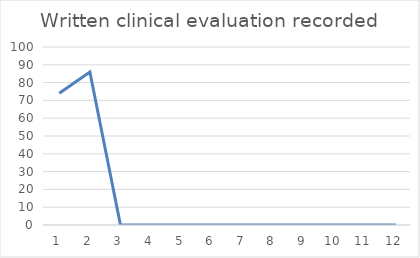
| Category | Written clinical evaluation recorded |
|---|---|
| 0 | 74 |
| 1 | 86 |
| 2 | 0 |
| 3 | 0 |
| 4 | 0 |
| 5 | 0 |
| 6 | 0 |
| 7 | 0 |
| 8 | 0 |
| 9 | 0 |
| 10 | 0 |
| 11 | 0 |